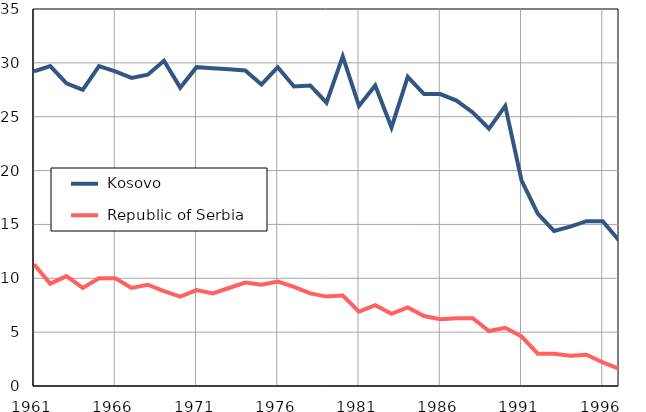
| Category |  Kosovo |  Republic of Serbia |
|---|---|---|
| 1961.0 | 29.2 | 11.3 |
| 1962.0 | 29.7 | 9.5 |
| 1963.0 | 28.1 | 10.2 |
| 1964.0 | 27.5 | 9.1 |
| 1965.0 | 29.7 | 10 |
| 1966.0 | 29.2 | 10 |
| 1967.0 | 28.6 | 9.1 |
| 1968.0 | 28.9 | 9.4 |
| 1969.0 | 30.2 | 8.8 |
| 1970.0 | 27.7 | 8.3 |
| 1971.0 | 29.6 | 8.9 |
| 1972.0 | 29.5 | 8.6 |
| 1973.0 | 29.4 | 9.1 |
| 1974.0 | 29.3 | 9.6 |
| 1975.0 | 28 | 9.4 |
| 1976.0 | 29.6 | 9.7 |
| 1977.0 | 27.8 | 9.2 |
| 1978.0 | 27.9 | 8.6 |
| 1979.0 | 26.3 | 8.3 |
| 1980.0 | 30.6 | 8.4 |
| 1981.0 | 26 | 6.9 |
| 1982.0 | 27.9 | 7.5 |
| 1983.0 | 24 | 6.7 |
| 1984.0 | 28.7 | 7.3 |
| 1985.0 | 27.1 | 6.5 |
| 1986.0 | 27.1 | 6.2 |
| 1987.0 | 26.5 | 6.3 |
| 1988.0 | 25.4 | 6.3 |
| 1989.0 | 23.9 | 5.1 |
| 1990.0 | 26 | 5.4 |
| 1991.0 | 19.1 | 4.6 |
| 1992.0 | 16 | 3 |
| 1993.0 | 14.4 | 3 |
| 1994.0 | 14.8 | 2.8 |
| 1995.0 | 15.3 | 2.9 |
| 1996.0 | 15.3 | 2.2 |
| 1997.0 | 13.5 | 1.6 |